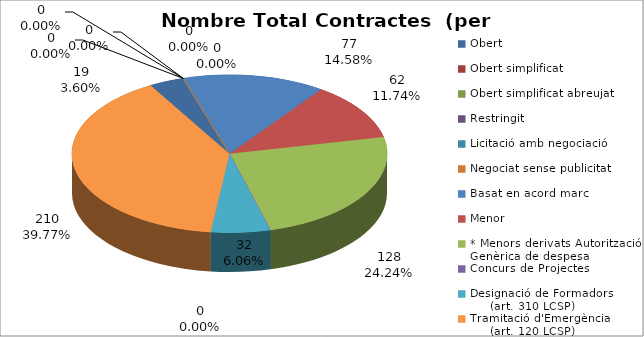
| Category | Nombre Total Contractes |
|---|---|
| Obert | 19 |
| Obert simplificat | 0 |
| Obert simplificat abreujat | 0 |
| Restringit | 0 |
| Licitació amb negociació | 0 |
| Negociat sense publicitat | 0 |
| Basat en acord marc | 77 |
| Menor | 62 |
| * Menors derivats Autorització Genèrica de despesa | 128 |
| Concurs de Projectes | 0 |
| Designació de Formadors
     (art. 310 LCSP) | 32 |
| Tramitació d'Emergència
     (art. 120 LCSP) | 210 |